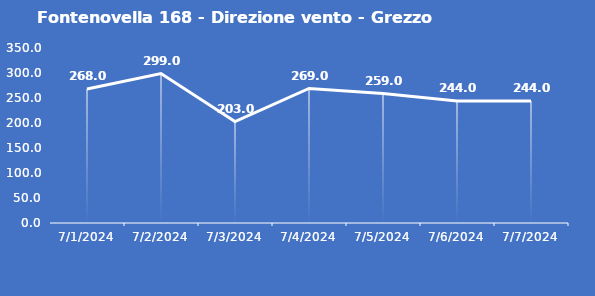
| Category | Fontenovella 168 - Direzione vento - Grezzo (°N) |
|---|---|
| 7/1/24 | 268 |
| 7/2/24 | 299 |
| 7/3/24 | 203 |
| 7/4/24 | 269 |
| 7/5/24 | 259 |
| 7/6/24 | 244 |
| 7/7/24 | 244 |